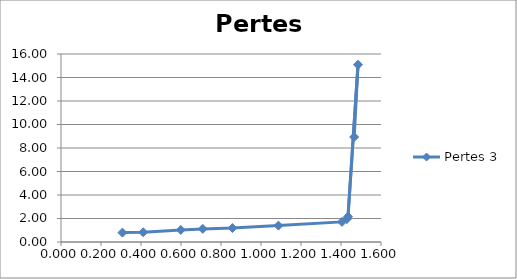
| Category | Pertes 3 |
|---|---|
| 1.466 | 8.936 |
| 1.485 | 15.087 |
| 1.435 | 2.152 |
| 1.429 | 1.943 |
| 1.405 | 1.712 |
| 1.087 | 1.395 |
| 0.857 | 1.187 |
| 0.709 | 1.114 |
| 0.599 | 1.026 |
| 0.411 | 0.83 |
| 0.307 | 0.798 |